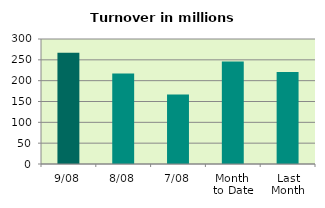
| Category | Series 0 |
|---|---|
| 9/08 | 266.852 |
| 8/08 | 217.413 |
| 7/08 | 167.1 |
| Month 
to Date | 245.887 |
| Last
Month | 220.762 |